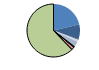
| Category | Series 0 |
|---|---|
| ARRASTRE | 255 |
| CERCO | 107 |
| ATUNEROS CAÑEROS | 6 |
| PALANGRE DE FONDO | 15 |
| PALANGRE DE SUPERFICIE | 35 |
| RASCO | 6 |
| VOLANTA | 6 |
| ARTES FIJAS | 22 |
| ARTES MENORES | 745 |